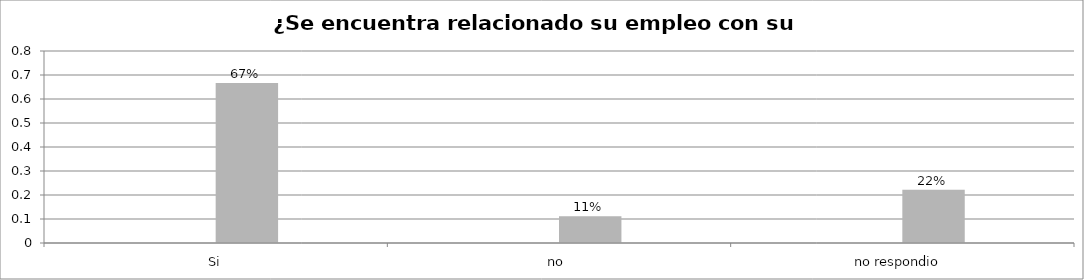
| Category | Series 0 | Series 1 | Series 2 | Series 3 |
|---|---|---|---|---|
| Si |  |  | 0.667 |  |
| no  |  |  | 0.111 |  |
| no respondio  |  |  | 0.222 |  |